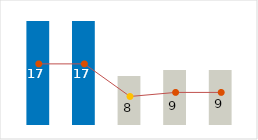
| Category | Profit |
|---|---|
| 0 | 17 |
| 1 | 17 |
| 2 | 8 |
| 3 | 9 |
| 4 | 9 |